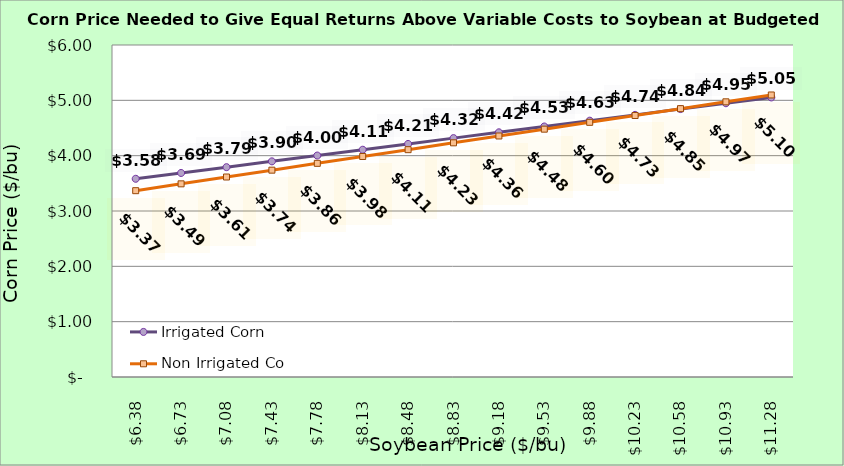
| Category | Irrigated Corn | Non Irrigated Corn |
|---|---|---|
| 6.380000000000003 | 3.582 | 3.367 |
| 6.730000000000002 | 3.687 | 3.491 |
| 7.080000000000002 | 3.792 | 3.614 |
| 7.4300000000000015 | 3.897 | 3.738 |
| 7.780000000000001 | 4.002 | 3.861 |
| 8.13 | 4.107 | 3.985 |
| 8.48 | 4.212 | 4.109 |
| 8.83 | 4.317 | 4.232 |
| 9.18 | 4.422 | 4.356 |
| 9.53 | 4.527 | 4.479 |
| 9.879999999999999 | 4.632 | 4.603 |
| 10.229999999999999 | 4.737 | 4.726 |
| 10.579999999999998 | 4.842 | 4.85 |
| 10.929999999999998 | 4.947 | 4.973 |
| 11.279999999999998 | 5.052 | 5.097 |